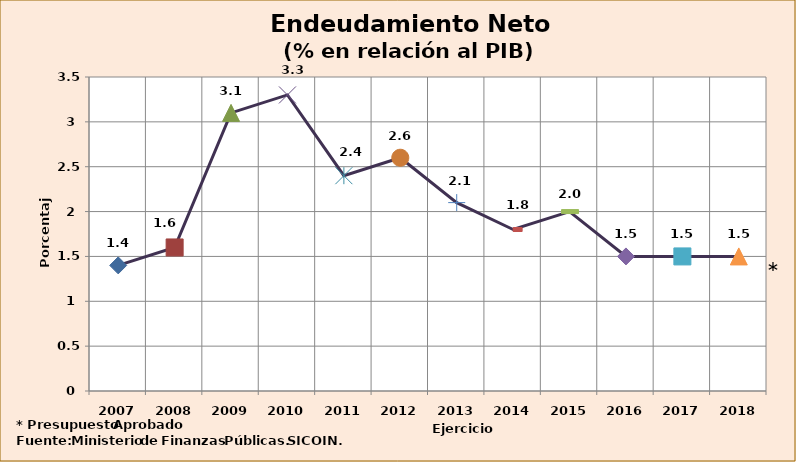
| Category | Series 0 |
|---|---|
| 2007 | 1.4 |
| 2008 | 1.6 |
| 2009 | 3.1 |
| 2010 | 3.3 |
| 2011 | 2.4 |
| 2012 | 2.6 |
| 2013 | 2.1 |
| 2014 | 1.8 |
| 2015 | 2 |
| 2016 | 1.5 |
| 2017 | 1.5 |
| 2018 | 1.5 |